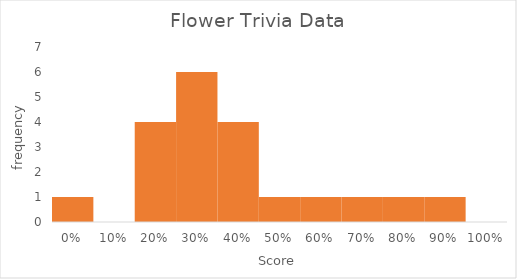
| Category | Series 1 |
|---|---|
| 0.0 | 1 |
| 0.1 | 0 |
| 0.2 | 4 |
| 0.3 | 6 |
| 0.4 | 4 |
| 0.5 | 1 |
| 0.6 | 1 |
| 0.7 | 1 |
| 0.8 | 1 |
| 0.9 | 1 |
| 1.0 | 0 |